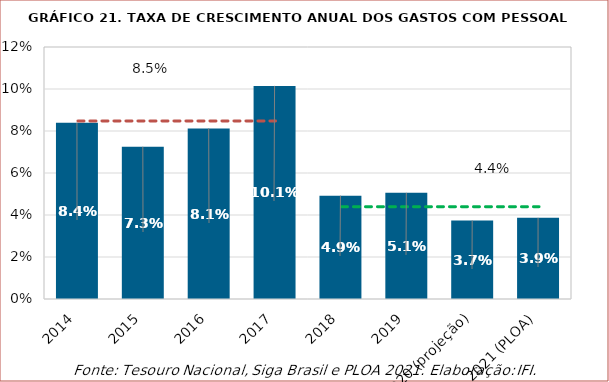
| Category | Taxa de crescimento |
|---|---|
| 2014 | 0.084 |
| 2015 | 0.073 |
| 2016 | 0.081 |
| 2017 | 0.101 |
| 2018 | 0.049 |
| 2019 | 0.051 |
| 2020 (projeção) | 0.037 |
| 2021 (PLOA) | 0.039 |